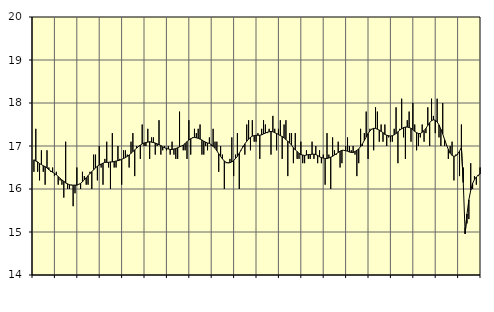
| Category | Handel, SNI 45-47 | Series 1 |
|---|---|---|
| nan | 16.4 | 16.68 |
| 1.0 | 17.4 | 16.65 |
| 1.0 | 16.4 | 16.63 |
| 1.0 | 16.2 | 16.59 |
| 1.0 | 16.9 | 16.57 |
| 1.0 | 16.4 | 16.54 |
| 1.0 | 16.1 | 16.52 |
| 1.0 | 16.9 | 16.49 |
| 1.0 | 16.5 | 16.45 |
| 1.0 | 16.4 | 16.42 |
| 1.0 | 16.5 | 16.39 |
| 1.0 | 16.3 | 16.36 |
| nan | 16.4 | 16.33 |
| 2.0 | 16.1 | 16.29 |
| 2.0 | 16.2 | 16.25 |
| 2.0 | 16.1 | 16.21 |
| 2.0 | 15.8 | 16.18 |
| 2.0 | 17.1 | 16.14 |
| 2.0 | 16 | 16.12 |
| 2.0 | 16 | 16.1 |
| 2.0 | 16.1 | 16.09 |
| 2.0 | 15.6 | 16.09 |
| 2.0 | 15.9 | 16.09 |
| 2.0 | 16.5 | 16.09 |
| nan | 16.1 | 16.11 |
| 3.0 | 16 | 16.13 |
| 3.0 | 16.4 | 16.17 |
| 3.0 | 16.3 | 16.21 |
| 3.0 | 16.1 | 16.26 |
| 3.0 | 16.1 | 16.31 |
| 3.0 | 16.4 | 16.36 |
| 3.0 | 16 | 16.4 |
| 3.0 | 16.8 | 16.45 |
| 3.0 | 16.8 | 16.49 |
| 3.0 | 16.2 | 16.53 |
| 3.0 | 17 | 16.56 |
| nan | 16.5 | 16.58 |
| 4.0 | 16.1 | 16.6 |
| 4.0 | 16.7 | 16.62 |
| 4.0 | 17.1 | 16.62 |
| 4.0 | 16.5 | 16.62 |
| 4.0 | 16 | 16.63 |
| 4.0 | 17.3 | 16.63 |
| 4.0 | 16.5 | 16.64 |
| 4.0 | 16.5 | 16.65 |
| 4.0 | 17 | 16.66 |
| 4.0 | 16.7 | 16.67 |
| 4.0 | 16.1 | 16.69 |
| nan | 16.9 | 16.71 |
| 5.0 | 16.9 | 16.73 |
| 5.0 | 16.8 | 16.76 |
| 5.0 | 16.5 | 16.79 |
| 5.0 | 17.1 | 16.83 |
| 5.0 | 17.3 | 16.87 |
| 5.0 | 16.3 | 16.91 |
| 5.0 | 17 | 16.95 |
| 5.0 | 17 | 16.99 |
| 5.0 | 16.7 | 17.02 |
| 5.0 | 17.5 | 17.05 |
| 5.0 | 17 | 17.07 |
| nan | 17 | 17.08 |
| 6.0 | 17.4 | 17.09 |
| 6.0 | 16.7 | 17.1 |
| 6.0 | 17.2 | 17.09 |
| 6.0 | 17.2 | 17.08 |
| 6.0 | 16.8 | 17.07 |
| 6.0 | 17 | 17.05 |
| 6.0 | 17.6 | 17.03 |
| 6.0 | 16.8 | 17.01 |
| 6.0 | 16.9 | 16.98 |
| 6.0 | 17 | 16.96 |
| 6.0 | 16.9 | 16.94 |
| nan | 17 | 16.93 |
| 7.0 | 16.8 | 16.92 |
| 7.0 | 17.1 | 16.92 |
| 7.0 | 16.8 | 16.93 |
| 7.0 | 16.7 | 16.94 |
| 7.0 | 16.7 | 16.96 |
| 7.0 | 17.8 | 16.98 |
| 7.0 | 17 | 17 |
| 7.0 | 16.9 | 17.02 |
| 7.0 | 16.9 | 17.06 |
| 7.0 | 16.7 | 17.1 |
| 7.0 | 17.6 | 17.14 |
| nan | 16.8 | 17.17 |
| 8.0 | 17.2 | 17.19 |
| 8.0 | 17.4 | 17.2 |
| 8.0 | 17.3 | 17.19 |
| 8.0 | 17.4 | 17.18 |
| 8.0 | 17.5 | 17.16 |
| 8.0 | 16.8 | 17.14 |
| 8.0 | 16.8 | 17.11 |
| 8.0 | 17 | 17.09 |
| 8.0 | 16.9 | 17.07 |
| 8.0 | 17.2 | 17.06 |
| 8.0 | 17 | 17.03 |
| nan | 17.4 | 16.99 |
| 9.0 | 17.1 | 16.95 |
| 9.0 | 17.1 | 16.89 |
| 9.0 | 16.4 | 16.82 |
| 9.0 | 17 | 16.76 |
| 9.0 | 16.8 | 16.7 |
| 9.0 | 16 | 16.65 |
| 9.0 | 16.6 | 16.62 |
| 9.0 | 16.6 | 16.61 |
| 9.0 | 16.7 | 16.61 |
| 9.0 | 17.2 | 16.63 |
| 9.0 | 16.3 | 16.66 |
| nan | 16.8 | 16.71 |
| 10.0 | 17.3 | 16.76 |
| 10.0 | 16 | 16.83 |
| 10.0 | 16.9 | 16.91 |
| 10.0 | 17 | 16.98 |
| 10.0 | 16.8 | 17.05 |
| 10.0 | 17.5 | 17.11 |
| 10.0 | 17.6 | 17.16 |
| 10.0 | 16.9 | 17.2 |
| 10.0 | 17.6 | 17.23 |
| 10.0 | 17.1 | 17.24 |
| 10.0 | 17.1 | 17.25 |
| nan | 17.3 | 17.25 |
| 11.0 | 16.7 | 17.25 |
| 11.0 | 17.4 | 17.26 |
| 11.0 | 17.6 | 17.28 |
| 11.0 | 17.5 | 17.3 |
| 11.0 | 17.3 | 17.32 |
| 11.0 | 17.4 | 17.33 |
| 11.0 | 16.8 | 17.34 |
| 11.0 | 17.7 | 17.33 |
| 11.0 | 17.4 | 17.31 |
| 11.0 | 16.9 | 17.29 |
| 11.0 | 17.4 | 17.27 |
| nan | 17.6 | 17.24 |
| 12.0 | 16.7 | 17.22 |
| 12.0 | 17.5 | 17.19 |
| 12.0 | 17.6 | 17.15 |
| 12.0 | 16.3 | 17.11 |
| 12.0 | 17.3 | 17.07 |
| 12.0 | 17.3 | 17.02 |
| 12.0 | 16.6 | 16.96 |
| 12.0 | 17.3 | 16.91 |
| 12.0 | 16.7 | 16.87 |
| 12.0 | 16.7 | 16.83 |
| 12.0 | 17.1 | 16.8 |
| nan | 16.6 | 16.79 |
| 13.0 | 16.6 | 16.78 |
| 13.0 | 16.9 | 16.79 |
| 13.0 | 16.7 | 16.8 |
| 13.0 | 16.7 | 16.8 |
| 13.0 | 17.1 | 16.81 |
| 13.0 | 16.7 | 16.81 |
| 13.0 | 17 | 16.8 |
| 13.0 | 16.6 | 16.78 |
| 13.0 | 16.9 | 16.75 |
| 13.0 | 16.6 | 16.73 |
| 13.0 | 16.8 | 16.72 |
| nan | 16.1 | 16.71 |
| 14.0 | 17.3 | 16.71 |
| 14.0 | 16.8 | 16.72 |
| 14.0 | 16 | 16.74 |
| 14.0 | 17.2 | 16.76 |
| 14.0 | 16.9 | 16.79 |
| 14.0 | 16.8 | 16.82 |
| 14.0 | 17.1 | 16.85 |
| 14.0 | 16.5 | 16.88 |
| 14.0 | 16.6 | 16.9 |
| 14.0 | 16.9 | 16.9 |
| 14.0 | 17 | 16.89 |
| nan | 17.2 | 16.88 |
| 15.0 | 17 | 16.86 |
| 15.0 | 16.9 | 16.85 |
| 15.0 | 17 | 16.85 |
| 15.0 | 16.8 | 16.87 |
| 15.0 | 16.3 | 16.9 |
| 15.0 | 16.6 | 16.93 |
| 15.0 | 17.4 | 16.99 |
| 15.0 | 17 | 17.05 |
| 15.0 | 17.3 | 17.13 |
| 15.0 | 17.8 | 17.21 |
| 15.0 | 16.7 | 17.29 |
| nan | 17.4 | 17.35 |
| 16.0 | 17.4 | 17.39 |
| 16.0 | 16.9 | 17.41 |
| 16.0 | 17.9 | 17.41 |
| 16.0 | 17.8 | 17.39 |
| 16.0 | 17.1 | 17.37 |
| 16.0 | 17.5 | 17.34 |
| 16.0 | 17.1 | 17.31 |
| 16.0 | 17.5 | 17.27 |
| 16.0 | 17 | 17.25 |
| 16.0 | 17.2 | 17.24 |
| 16.0 | 17.1 | 17.23 |
| nan | 17.1 | 17.24 |
| 17.0 | 17.4 | 17.26 |
| 17.0 | 17.9 | 17.29 |
| 17.0 | 16.6 | 17.33 |
| 17.0 | 17.4 | 17.37 |
| 17.0 | 18.1 | 17.4 |
| 17.0 | 17.2 | 17.43 |
| 17.0 | 16.7 | 17.44 |
| 17.0 | 17.6 | 17.44 |
| 17.0 | 17.8 | 17.43 |
| 17.0 | 17.1 | 17.41 |
| 17.0 | 18 | 17.38 |
| nan | 17.5 | 17.34 |
| 18.0 | 16.9 | 17.31 |
| 18.0 | 17 | 17.29 |
| 18.0 | 17.2 | 17.29 |
| 18.0 | 17.5 | 17.32 |
| 18.0 | 17.1 | 17.36 |
| 18.0 | 17.3 | 17.41 |
| 18.0 | 17.9 | 17.48 |
| 18.0 | 17 | 17.54 |
| 18.0 | 18.1 | 17.59 |
| 18.0 | 17.7 | 17.61 |
| 18.0 | 17.3 | 17.6 |
| nan | 18.1 | 17.56 |
| 19.0 | 17.2 | 17.49 |
| 19.0 | 17 | 17.39 |
| 19.0 | 18 | 17.28 |
| 19.0 | 17 | 17.15 |
| 19.0 | 17 | 17.03 |
| 19.0 | 16.7 | 16.92 |
| 19.0 | 17 | 16.83 |
| 19.0 | 17.1 | 16.78 |
| 19.0 | 16.2 | 16.76 |
| 19.0 | 16.8 | 16.77 |
| 19.0 | 16.8 | 16.82 |
| nan | 16.3 | 16.88 |
| 20.0 | 17.5 | 16.97 |
| 20.0 | 16.5 | 16.15 |
| 20.0 | 15.1 | 14.96 |
| 20.0 | 15.2 | 15.42 |
| 20.0 | 15.3 | 15.75 |
| 20.0 | 16.6 | 15.97 |
| 20.0 | 16 | 16.13 |
| 20.0 | 16.3 | 16.22 |
| 20.0 | 16.1 | 16.28 |
| 20.0 | 16.3 | 16.32 |
| 20.0 | 16.5 | 16.35 |